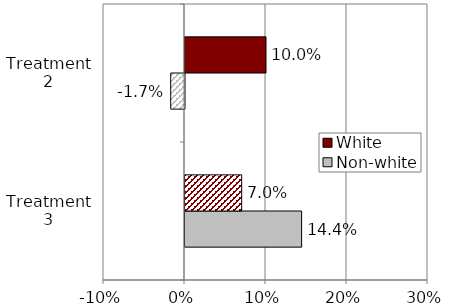
| Category | Non-white | White |
|---|---|---|
| Treatment 3 | 0.144 | 0.07 |
| Treatment 2 | -0.017 | 0.1 |